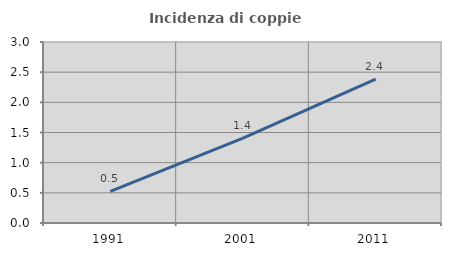
| Category | Incidenza di coppie miste |
|---|---|
| 1991.0 | 0.524 |
| 2001.0 | 1.408 |
| 2011.0 | 2.387 |